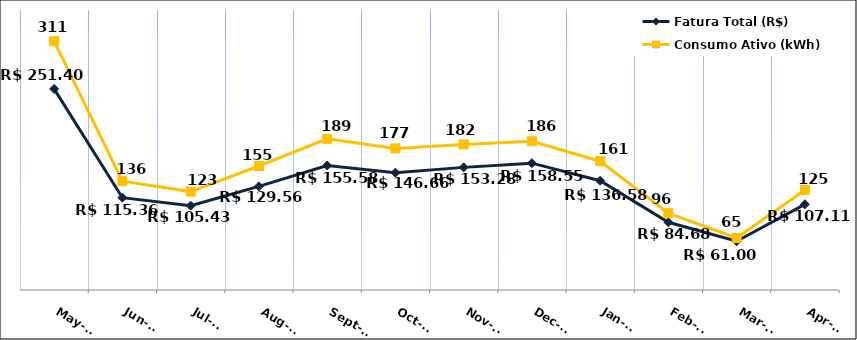
| Category | Fatura Total (R$) |
|---|---|
| 2023-05-01 | 251.4 |
| 2023-06-01 | 115.36 |
| 2023-07-01 | 105.43 |
| 2023-08-01 | 129.56 |
| 2023-09-01 | 155.58 |
| 2023-10-01 | 146.66 |
| 2023-11-01 | 153.28 |
| 2023-12-01 | 158.55 |
| 2024-01-01 | 136.58 |
| 2024-02-01 | 84.68 |
| 2024-03-01 | 61 |
| 2024-04-01 | 107.11 |